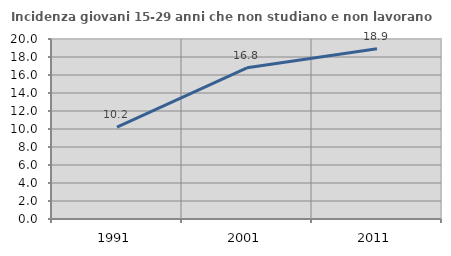
| Category | Incidenza giovani 15-29 anni che non studiano e non lavorano  |
|---|---|
| 1991.0 | 10.203 |
| 2001.0 | 16.794 |
| 2011.0 | 18.919 |